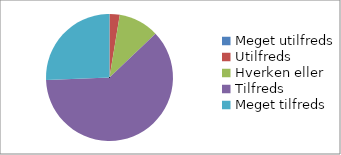
| Category | Hvor tilfreds er du med opfølgningen på gruppearbejdets i arrangementets sidste del? (n=39) |
|---|---|
| Meget utilfreds | 0 |
| Utilfreds | 0.026 |
| Hverken eller | 0.103 |
| Tilfreds | 0.615 |
| Meget tilfreds | 0.256 |